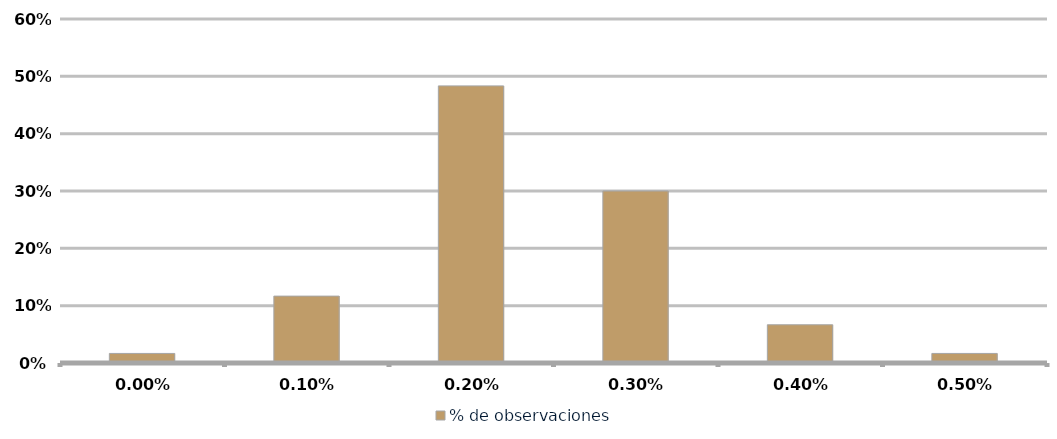
| Category | % de observaciones  |
|---|---|
| 0.0 | 0.017 |
| 0.001 | 0.117 |
| 0.002 | 0.483 |
| 0.003 | 0.3 |
| 0.004 | 0.067 |
| 0.005 | 0.017 |